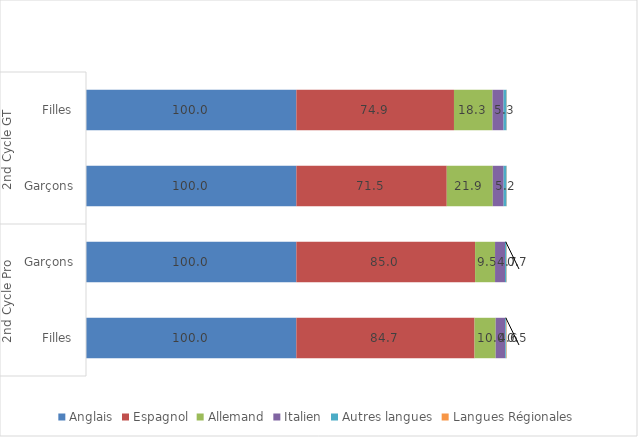
| Category | Anglais | Espagnol | Allemand | Italien | Autres langues | Langues Régionales |
|---|---|---|---|---|---|---|
| 0 | 99.977 | 74.918 | 18.298 | 5.277 | 1.422 | 0.109 |
| 1 | 99.983 | 71.482 | 21.866 | 5.175 | 1.383 | 0.11 |
| 2 | 99.972 | 84.952 | 9.49 | 4.734 | 0.705 | 0.148 |
| 3 | 99.967 | 84.695 | 10.038 | 4.567 | 0.517 | 0.215 |